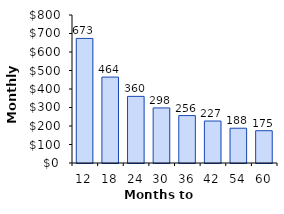
| Category | Payment |
|---|---|
| 12.0 | 673.403 |
| 18.0 | 464.364 |
| 24.0 | 360.097 |
| 30.0 | 297.738 |
| 36.0 | 256.332 |
| 42.0 | 226.899 |
| 54.0 | 187.985 |
| 60.0 | 174.512 |